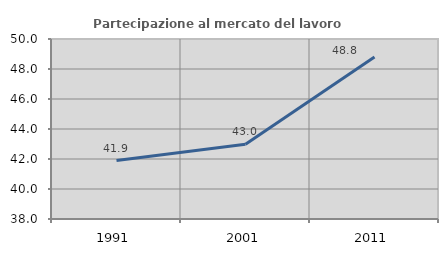
| Category | Partecipazione al mercato del lavoro  femminile |
|---|---|
| 1991.0 | 41.896 |
| 2001.0 | 42.979 |
| 2011.0 | 48.794 |